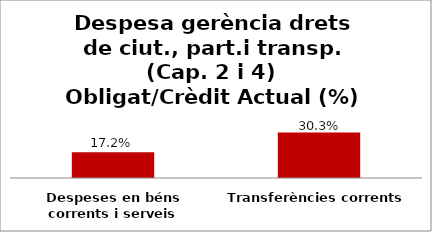
| Category | Series 0 |
|---|---|
| Despeses en béns corrents i serveis | 0.172 |
| Transferències corrents | 0.303 |